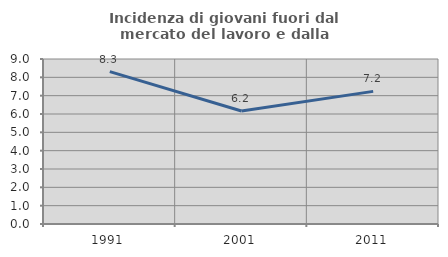
| Category | Incidenza di giovani fuori dal mercato del lavoro e dalla formazione  |
|---|---|
| 1991.0 | 8.313 |
| 2001.0 | 6.165 |
| 2011.0 | 7.234 |